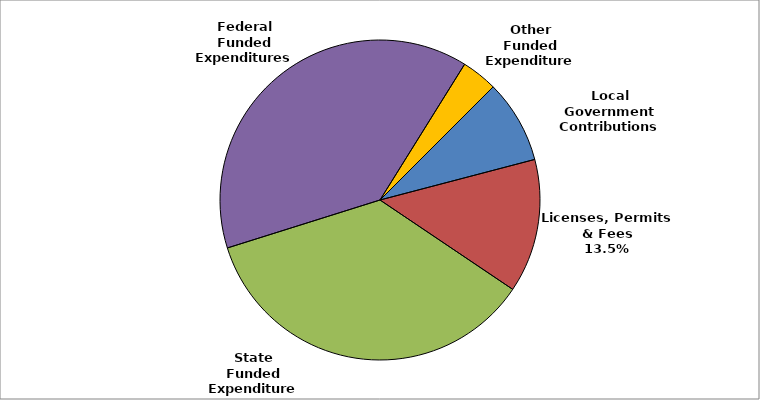
| Category | Series 0 |
|---|---|
| Local Government Contributions | 0.084 |
| Licenses, Permits & Fees | 0.135 |
| State Funded Expenditures | 0.357 |
| Federal Funded Expenditures | 0.387 |
| Other Funded Expenditures | 0.036 |